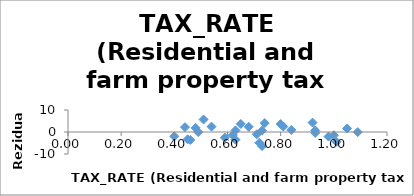
| Category | Series 0 |
|---|---|
| 1.09 | -0.043 |
| 1.01 | -4.463 |
| 0.4 | -1.976 |
| 0.93 | -0.43 |
| 0.92 | 4.28 |
| 0.59 | -2.563 |
| 0.6300000000000001 | 0.698 |
| 0.49000000000000005 | -0.018 |
| 0.7100000000000001 | -1.041 |
| 0.93 | 0.704 |
| 0.51 | 5.697 |
| 0.8 | 3.612 |
| 0.7400000000000001 | 4.051 |
| 0.44000000000000006 | 2.202 |
| 0.81 | 2.49 |
| 1.05 | 1.611 |
| 0.7300000000000001 | 0.608 |
| 0.6500000000000001 | 3.654 |
| 0.48000000000000004 | 1.87 |
| 0.7200000000000001 | -4.885 |
| 0.6200000000000001 | -1.406 |
| 0.8400000000000001 | 0.927 |
| 0.7300000000000001 | -6.394 |
| 0.45 | -3.336 |
| 1.0 | -1.458 |
| 0.6300000000000001 | -3.493 |
| 0.54 | 2.445 |
| 0.98 | -2.068 |
| 0.46 | -3.622 |
| 0.6800000000000002 | 2.347 |